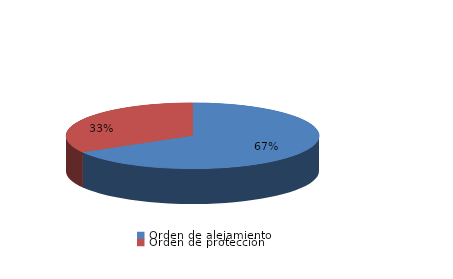
| Category | Series 0 |
|---|---|
| Orden de alejamiento | 8 |
| Orden de protección | 4 |